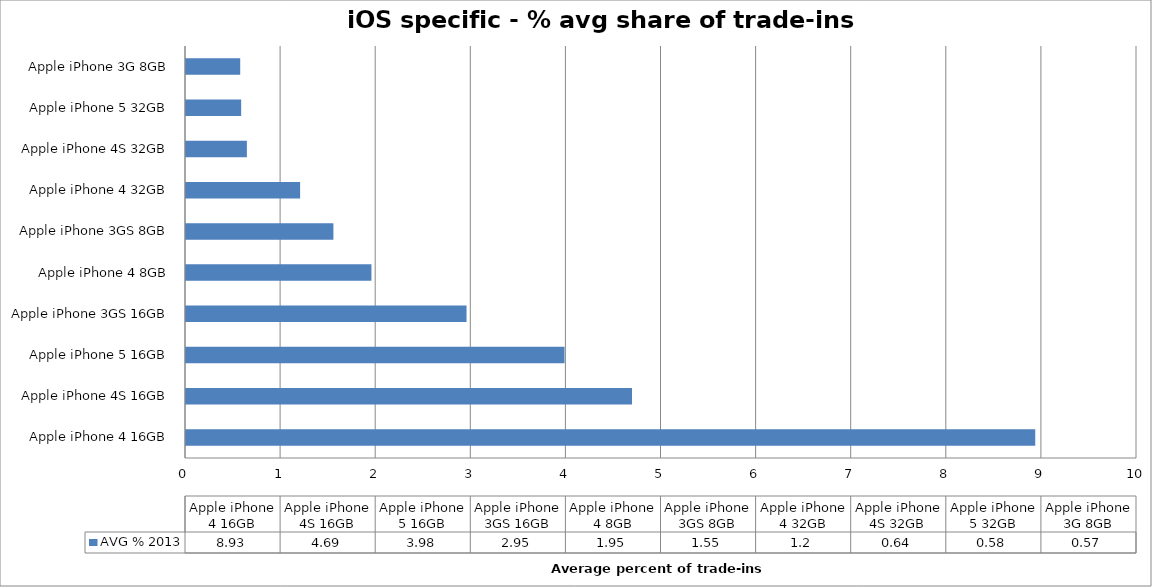
| Category | AVG % 2013 |
|---|---|
| Apple iPhone 4 16GB | 8.93 |
| Apple iPhone 4S 16GB | 4.69 |
| Apple iPhone 5 16GB | 3.98 |
| Apple iPhone 3GS 16GB | 2.95 |
| Apple iPhone 4 8GB | 1.95 |
| Apple iPhone 3GS 8GB | 1.55 |
| Apple iPhone 4 32GB | 1.2 |
| Apple iPhone 4S 32GB | 0.64 |
| Apple iPhone 5 32GB | 0.58 |
| Apple iPhone 3G 8GB | 0.57 |